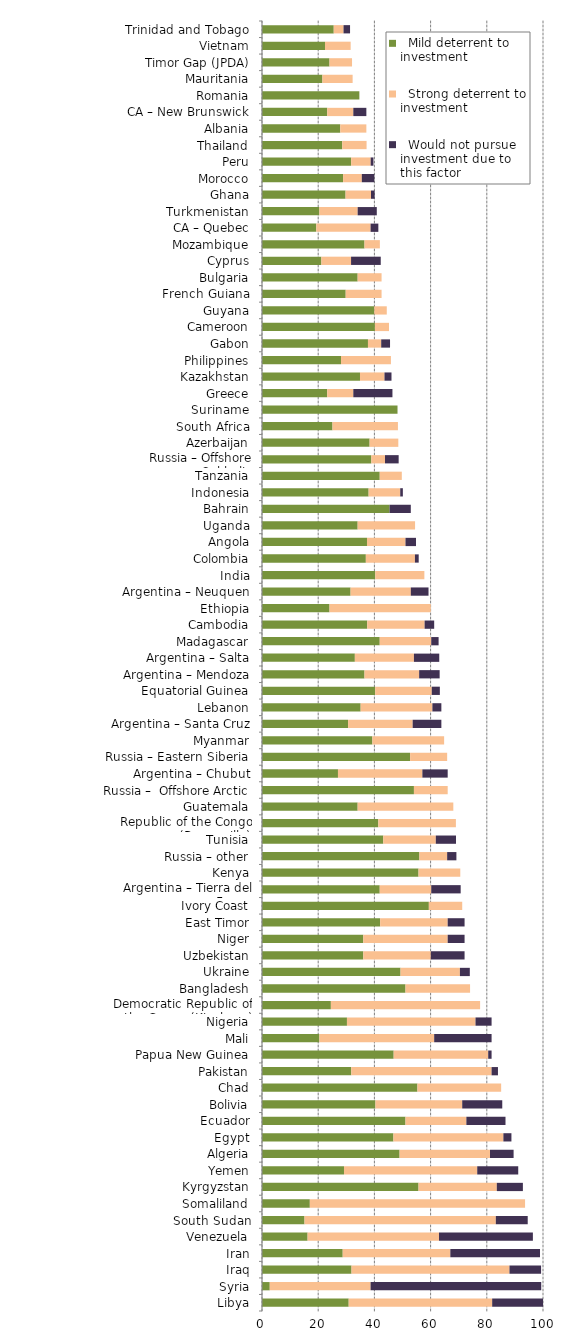
| Category |   Mild deterrent to investment |   Strong deterrent to investment |   Would not pursue investment due to this factor |
|---|---|---|---|
| Libya | 30.851 | 51.064 | 18.085 |
| Syria | 2.76 | 35.883 | 60.725 |
| Iraq | 31.856 | 56.217 | 11.243 |
| Iran | 28.723 | 38.298 | 31.915 |
| Venezuela | 16.226 | 46.769 | 33.406 |
| South Sudan | 15.13 | 68.085 | 11.348 |
| Somaliland | 17.021 | 76.596 | 0 |
| Kyrgyzstan | 55.706 | 27.853 | 9.284 |
| Yemen | 29.179 | 47.416 | 14.59 |
| Algeria | 48.965 | 32.177 | 8.394 |
| Egypt | 46.769 | 39.133 | 2.863 |
| Ecuador | 51.064 | 21.663 | 13.926 |
| Bolivia | 40.376 | 30.876 | 14.25 |
| Chad | 55.319 | 29.787 | 0 |
| Pakistan | 31.773 | 49.929 | 2.27 |
| Papua New Guinea | 46.859 | 33.642 | 1.202 |
| Mali | 20.426 | 40.851 | 20.426 |
| Nigeria | 30.23 | 45.753 | 5.719 |
| Democratic Republic of the Congo (Kinshasa) | 24.511 | 53.106 | 0 |
| Bangladesh | 51.064 | 22.979 | 0 |
| Ukraine | 49.303 | 21.13 | 3.522 |
| Uzbekistan | 36.045 | 24.03 | 12.015 |
| Niger | 36.045 | 30.038 | 6.008 |
| East Timor | 42.053 | 24.03 | 6.008 |
| Ivory Coast | 59.377 | 11.875 | 0 |
| Argentina – Tierra del Fuego | 41.899 | 18.331 | 10.475 |
| Kenya | 55.706 | 14.855 | 0 |
| Russia – other | 56.005 | 9.883 | 3.294 |
| Tunisia | 43.153 | 18.699 | 7.192 |
| Republic of the Congo (Brazzaville) | 41.403 | 27.602 | 0 |
| Guatemala | 34.043 | 34.043 | 0 |
| Russia –  Offshore Arctic | 54.068 | 12.015 | 0 |
| Argentina – Chubut | 27.034 | 30.038 | 9.011 |
| Russia – Eastern Siberia | 52.711 | 13.178 | 0 |
| Myanmar | 39.28 | 25.532 | 0 |
| Argentina – Santa Cruz | 30.638 | 22.979 | 10.213 |
| Lebanon | 35.106 | 25.532 | 3.191 |
| Equatorial Guinea | 40.276 | 20.138 | 2.877 |
| Argentina – Mendoza | 36.474 | 19.453 | 7.295 |
| Argentina – Salta | 33.041 | 21.026 | 9.011 |
| Madagascar | 41.899 | 18.331 | 2.619 |
| Cambodia | 37.447 | 20.426 | 3.404 |
| Ethiopia | 24.03 | 36.045 | 0 |
| Argentina – Neuquen | 31.521 | 21.434 | 6.304 |
| India | 40.314 | 17.469 | 0 |
| Colombia | 36.954 | 17.469 | 1.344 |
| Angola | 37.364 | 13.7 | 3.736 |
| Uganda | 34.043 | 20.426 | 0 |
| Bahrain | 45.39 | 0 | 7.565 |
| Indonesia | 37.947 | 11.243 | 0.937 |
| Tanzania | 41.899 | 7.856 | 0 |
| Russia – Offshore Sakhalin | 38.906 | 4.863 | 4.863 |
| Azerbaijan | 38.298 | 10.213 | 0 |
| South Africa | 25.084 | 23.292 | 0 |
| Suriname | 48.227 | 0 | 0 |
| Greece | 23.211 | 9.284 | 13.926 |
| Kazakhstan | 34.873 | 8.718 | 2.491 |
| Philippines | 28.122 | 17.761 | 0 |
| Gabon | 37.709 | 4.714 | 3.142 |
| Cameroon | 40.181 | 5.023 | 0 |
| Guyana | 39.963 | 4.44 | 0 |
| French Guiana | 29.787 | 12.766 | 0 |
| Bulgaria | 34.043 | 8.511 | 0 |
| Cyprus | 21.13 | 10.565 | 10.565 |
| Mozambique | 36.474 | 5.471 | 0 |
| CA – Quebec | 19.321 | 19.321 | 2.76 |
| Turkmenistan | 20.426 | 13.617 | 6.809 |
| Ghana | 29.733 | 9.049 | 1.293 |
| Morocco | 28.862 | 6.66 | 4.44 |
| Peru | 31.729 | 6.941 | 0.992 |
| Thailand | 28.561 | 8.655 | 0 |
| Albania | 27.853 | 9.284 | 0 |
| CA – New Brunswick | 23.211 | 9.284 | 4.642 |
| Romania | 34.65 | 0 | 0 |
| Mauritania | 21.501 | 10.75 | 0 |
| Timor Gap (JPDA) | 24.03 | 8.01 | 0 |
| Vietnam | 22.418 | 9.133 | 0 |
| Trinidad and Tobago | 25.532 | 3.482 | 2.321 |